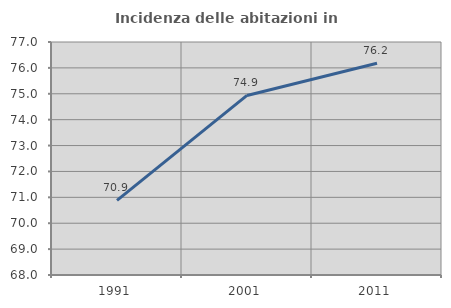
| Category | Incidenza delle abitazioni in proprietà  |
|---|---|
| 1991.0 | 70.883 |
| 2001.0 | 74.936 |
| 2011.0 | 76.177 |